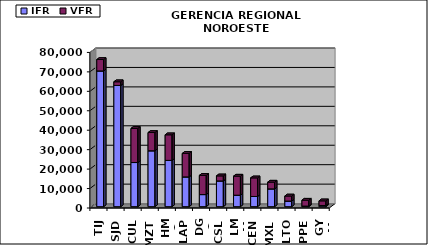
| Category | IFR | VFR |
|---|---|---|
| TIJ | 69802 | 5868 |
| SJD | 62344 | 1888 |
| CUL | 22702 | 17536 |
| MZT | 28747 | 9380 |
| HMO | 23800 | 13159 |
| LAP | 15307 | 12082 |
| DGO | 6222 | 9875 |
| CSL | 13235 | 2597 |
| LMM | 5901 | 9794 |
| CEN | 5241 | 9563 |
| MXL | 9144 | 3463 |
| LTO | 2880 | 2606 |
| PPE | 298 | 3030 |
| GYM | 618 | 2376 |